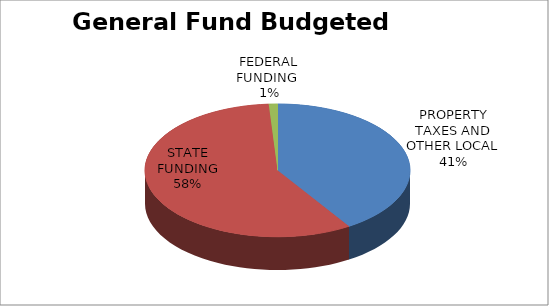
| Category | Series 1 |
|---|---|
| PROPERTY TAXES AND OTHER LOCAL | 28114159 |
| STATE FUNDING | 39852531 |
| FEDERAL FUNDING  | 725500 |